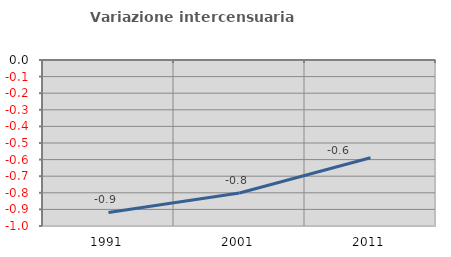
| Category | Variazione intercensuaria annua |
|---|---|
| 1991.0 | -0.918 |
| 2001.0 | -0.801 |
| 2011.0 | -0.589 |